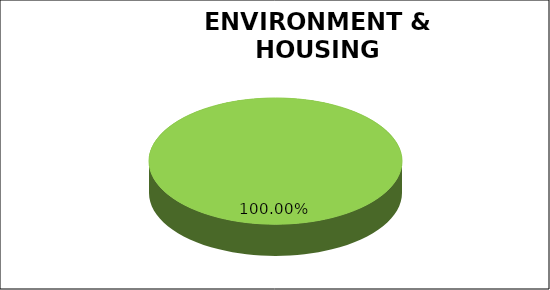
| Category | Green | Amber | Red |
|---|---|---|---|
| Q1 | 1 | 0 | 0 |